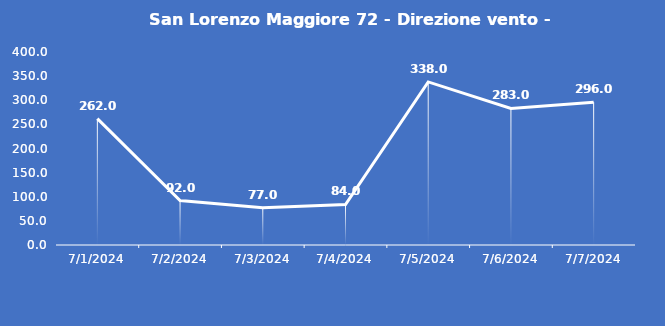
| Category | San Lorenzo Maggiore 72 - Direzione vento - Grezzo (°N) |
|---|---|
| 7/1/24 | 262 |
| 7/2/24 | 92 |
| 7/3/24 | 77 |
| 7/4/24 | 84 |
| 7/5/24 | 338 |
| 7/6/24 | 283 |
| 7/7/24 | 296 |